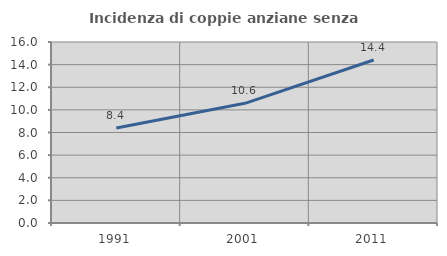
| Category | Incidenza di coppie anziane senza figli  |
|---|---|
| 1991.0 | 8.393 |
| 2001.0 | 10.579 |
| 2011.0 | 14.411 |